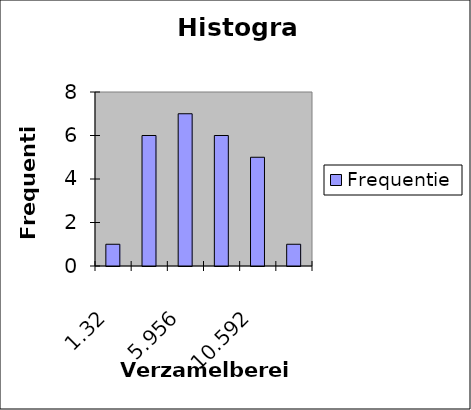
| Category | Frequentie |
|---|---|
| 1,32 | 1 |
| 3,638 | 6 |
| 5,956 | 7 |
| 8,274 | 6 |
| 10,592 | 5 |
| Meer | 1 |